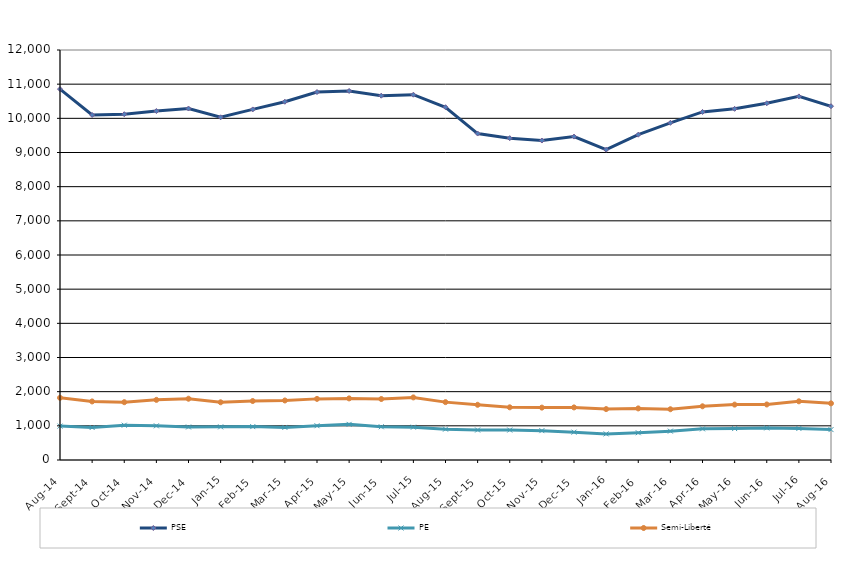
| Category | PSE | PE | Semi-Liberté |
|---|---|---|---|
| 2014-08-01 | 10856 | 992 | 1820 |
| 2014-09-01 | 10098 | 951 | 1714 |
| 2014-10-01 | 10120 | 1018 | 1692 |
| 2014-11-01 | 10213 | 1000 | 1760 |
| 2014-12-01 | 10287 | 966 | 1794 |
| 2015-01-01 | 10030 | 970 | 1689 |
| 2015-02-01 | 10261 | 977 | 1726 |
| 2015-03-01 | 10485 | 954 | 1742 |
| 2015-04-01 | 10770 | 1003 | 1789 |
| 2015-05-01 | 10801 | 1043 | 1803 |
| 2015-06-01 | 10662 | 973 | 1785 |
| 2015-07-01 | 10692 | 961 | 1832 |
| 2015-08-01 | 10325 | 903 | 1694 |
| 2015-09-01 | 9555 | 878 | 1616 |
| 2015-10-01 | 9420 | 877 | 1542 |
| 2015-11-01 | 9350 | 859 | 1533 |
| 2015-12-01 | 9466 | 815 | 1539 |
| 2016-01-01 | 9081 | 764 | 1490 |
| 2016-02-01 | 9521 | 798 | 1510 |
| 2016-03-01 | 9868 | 845 | 1486 |
| 2016-04-01 | 10187 | 912 | 1572 |
| 2016-05-01 | 10278 | 920 | 1621 |
| 2016-06-01 | 10441 | 939 | 1625 |
| 2016-07-01 | 10642 | 923 | 1718 |
| 2016-08-01 | 10355 | 890 | 1658 |